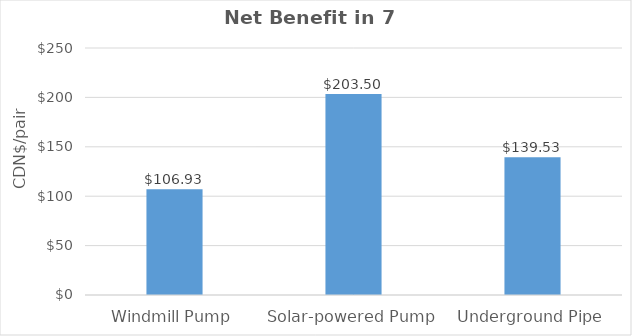
| Category | Net Benefits in 7 Year
($/pair) |
|---|---|
| Windmill Pump | 106.932 |
| Solar-powered Pump | 203.497 |
| Underground Pipe | 139.534 |